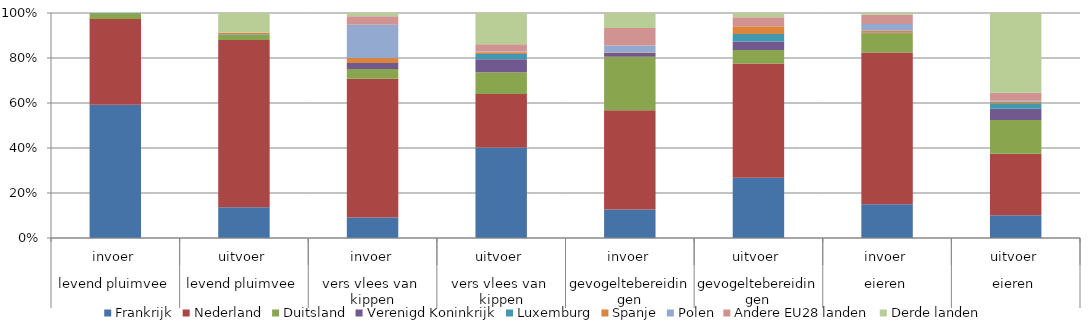
| Category | Frankrijk | Nederland | Duitsland | Verenigd Koninkrijk | Luxemburg | Spanje | Polen | Andere EU28 landen | Derde landen |
|---|---|---|---|---|---|---|---|---|---|
| 0 | 106.792 | 68.743 | 4.51 | 0 | 0.245 | 0 | 0 | 0.044 | 0 |
| 1 | 18.663 | 101.244 | 3.383 | 0.079 | 0.152 | 0.7 | 0.008 | 0.183 | 11.823 |
| 2 | 20.598 | 140.204 | 9.918 | 6.012 | 0.032 | 5.129 | 33.578 | 8.526 | 3.371 |
| 3 | 275.348 | 162.726 | 65.964 | 39.538 | 15.707 | 5.36 | 2.463 | 22.198 | 94.723 |
| 4 | 17.426 | 60.588 | 32.598 | 2.43 | 0.022 | 0.385 | 4.095 | 10.623 | 9.233 |
| 5 | 59.544 | 112.905 | 13.298 | 8.418 | 7.305 | 7.739 | 0.031 | 8.742 | 4.233 |
| 6 | 25.879 | 116.159 | 14.668 | 0.395 | 0.059 | 1.377 | 5.228 | 7.046 | 1.378 |
| 7 | 21.5 | 57.86 | 31.739 | 10.728 | 5.233 | 1.553 | 0.827 | 7.423 | 75.168 |